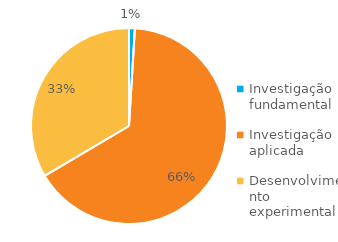
| Category | Series 0 |
|---|---|
| Investigação fundamental | 1.16 |
| Investigação aplicada | 79.275 |
| Desenvolvimento experimental | 40.507 |